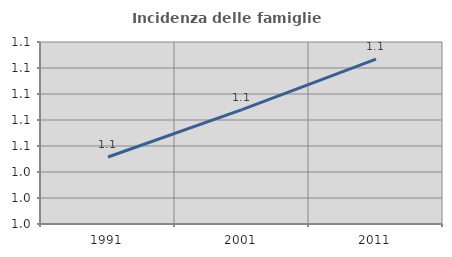
| Category | Incidenza delle famiglie numerose |
|---|---|
| 1991.0 | 1.052 |
| 2001.0 | 1.088 |
| 2011.0 | 1.127 |